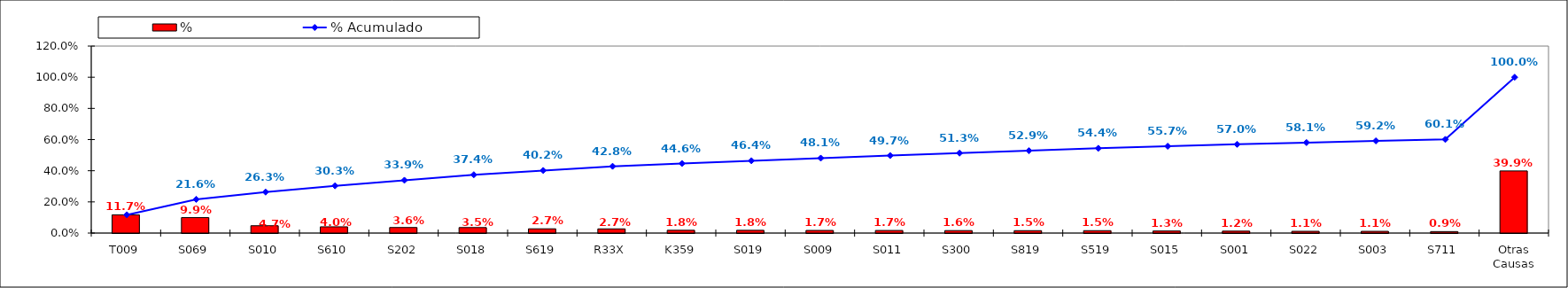
| Category | % |
|---|---|
| T009 | 0.117 |
| S069 | 0.099 |
| S010 | 0.047 |
| S610 | 0.04 |
| S202 | 0.036 |
| S018 | 0.035 |
| S619 | 0.027 |
| R33X | 0.027 |
| K359 | 0.018 |
| S019 | 0.018 |
| S009 | 0.017 |
| S011 | 0.017 |
| S300 | 0.016 |
| S819 | 0.015 |
| S519 | 0.015 |
| S015 | 0.013 |
| S001 | 0.012 |
| S022 | 0.011 |
| S003 | 0.011 |
| S711 | 0.009 |
| Otras Causas | 0.399 |